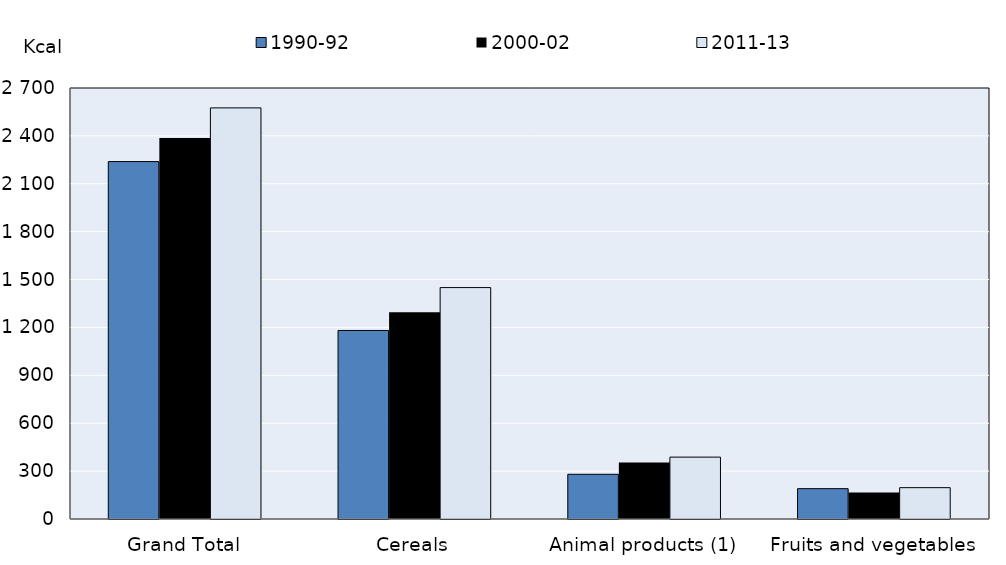
| Category | 1990-92 | 2000-02 | 2011-13 |
|---|---|---|---|
| Grand Total | 2239 | 2386 | 2575.333 |
| Cereals | 1181 | 1295.667 | 1449.667 |
| Animal products (1) | 280 | 354 | 387.667 |
| Fruits and vegetables | 190 | 165.667 | 196.333 |